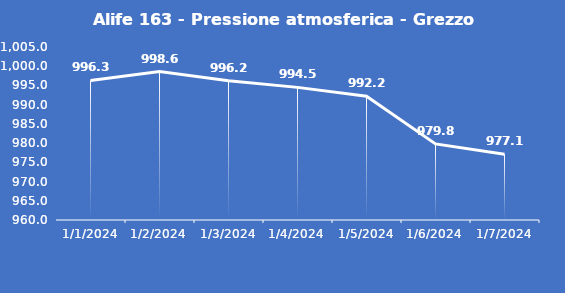
| Category | Alife 163 - Pressione atmosferica - Grezzo (hPa) |
|---|---|
| 1/1/24 | 996.3 |
| 1/2/24 | 998.6 |
| 1/3/24 | 996.2 |
| 1/4/24 | 994.5 |
| 1/5/24 | 992.2 |
| 1/6/24 | 979.8 |
| 1/7/24 | 977.1 |